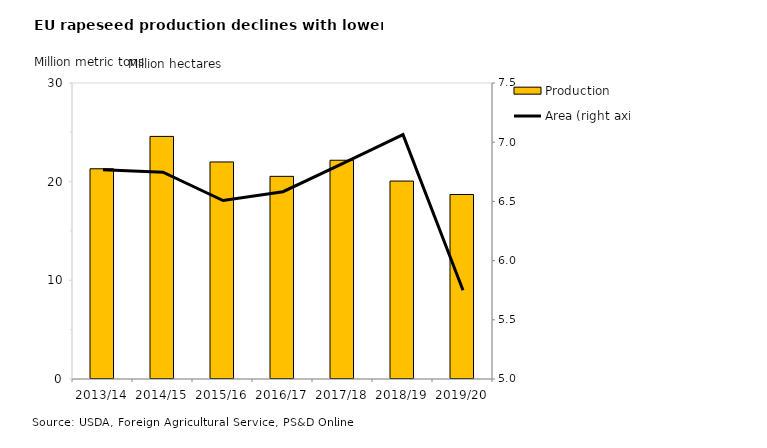
| Category | Production |
|---|---|
| 2013/14 | 21.306 |
| 2014/15 | 24.587 |
| 2015/16 | 21.997 |
| 2016/17 | 20.538 |
| 2017/18 | 22.171 |
| 2018/19 | 20.061 |
| 2019/20 | 18.7 |